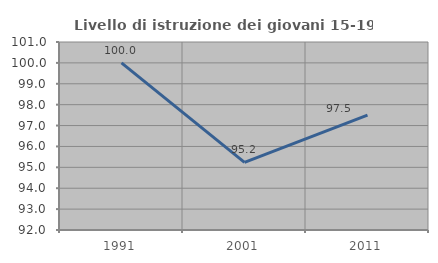
| Category | Livello di istruzione dei giovani 15-19 anni |
|---|---|
| 1991.0 | 100 |
| 2001.0 | 95.238 |
| 2011.0 | 97.5 |